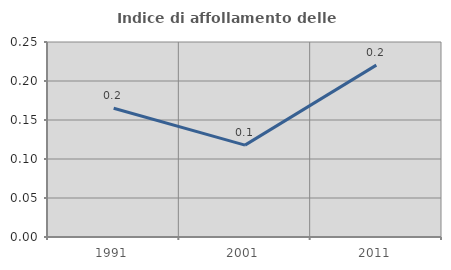
| Category | Indice di affollamento delle abitazioni  |
|---|---|
| 1991.0 | 0.165 |
| 2001.0 | 0.118 |
| 2011.0 | 0.22 |